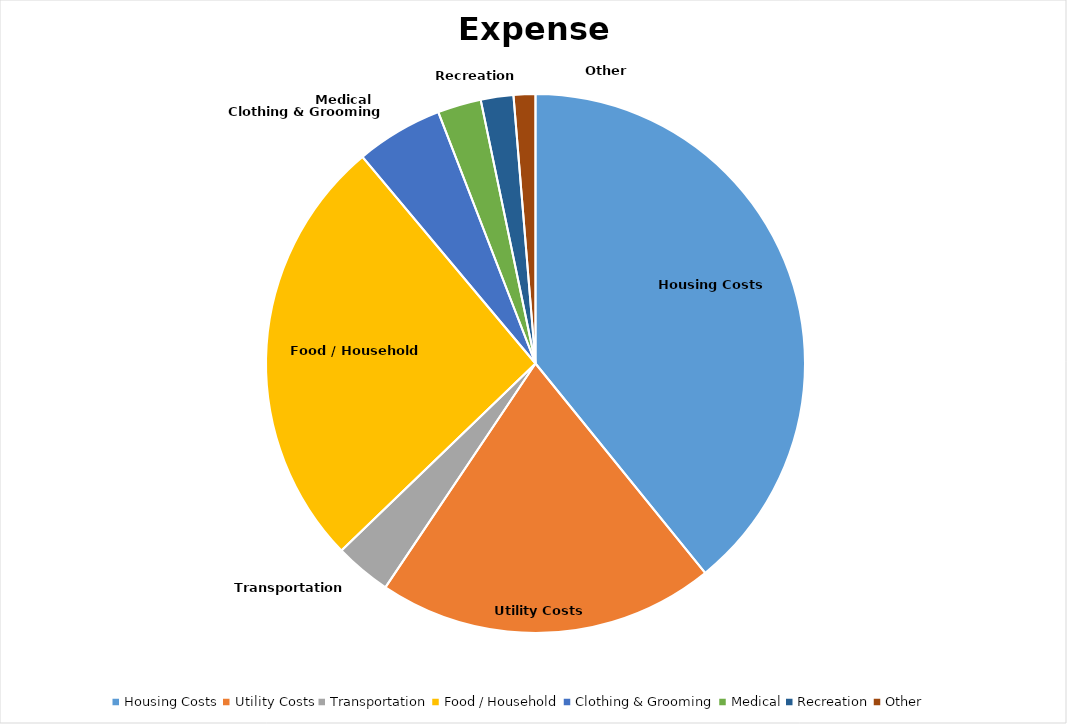
| Category | Series 0 |
|---|---|
| Housing Costs | 300 |
| Utility Costs | 155 |
| Transportation | 26 |
| Food / Household | 200 |
| Clothing & Grooming | 40 |
| Medical | 20 |
| Recreation | 15 |
| Other | 10 |